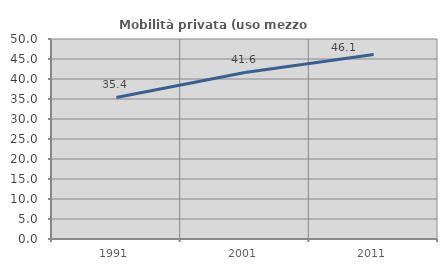
| Category | Mobilità privata (uso mezzo privato) |
|---|---|
| 1991.0 | 35.391 |
| 2001.0 | 41.648 |
| 2011.0 | 46.112 |